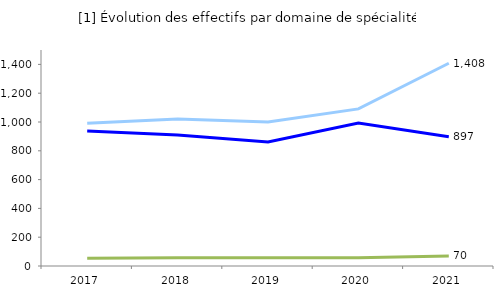
| Category | Domaines de la production | Domaines des services | Domaines disciplinaires |
|---|---|---|---|
| 2017 | 937 | 991 | 53 |
| 2018 | 910 | 1021 | 57 |
| 2019 | 862 | 1000 | 58 |
| 2020 | 993 | 1091 | 58 |
| 2021 | 897 | 1408 | 70 |